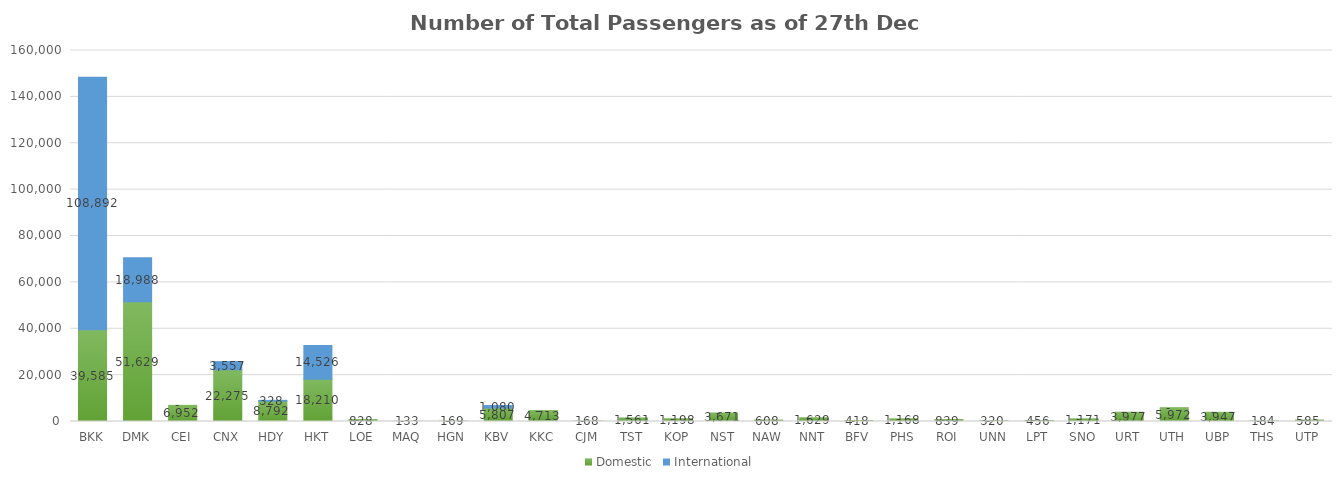
| Category | Domestic | International |
|---|---|---|
| BKK | 39585 | 108892 |
| DMK | 51629 | 18988 |
| CEI | 6952 | 0 |
| CNX | 22275 | 3557 |
| HDY | 8792 | 328 |
| HKT | 18210 | 14526 |
| LOE | 828 | 0 |
| MAQ | 133 | 0 |
| HGN | 169 | 0 |
| KBV | 5807 | 1080 |
| KKC | 4713 | 0 |
| CJM | 168 | 0 |
| TST | 1561 | 0 |
| KOP | 1198 | 0 |
| NST | 3671 | 0 |
| NAW | 608 | 0 |
| NNT | 1629 | 0 |
| BFV | 418 | 0 |
| PHS | 1168 | 0 |
| ROI | 839 | 0 |
| UNN | 320 | 0 |
| LPT | 456 | 0 |
| SNO | 1171 | 0 |
| URT | 3977 | 0 |
| UTH | 5972 | 0 |
| UBP | 3947 | 0 |
| THS | 184 | 0 |
| UTP | 585 | 0 |